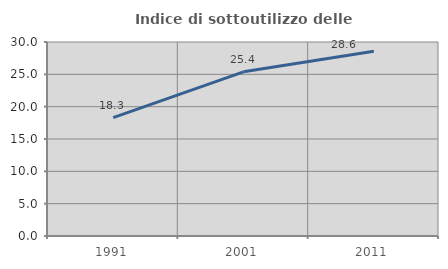
| Category | Indice di sottoutilizzo delle abitazioni  |
|---|---|
| 1991.0 | 18.307 |
| 2001.0 | 25.392 |
| 2011.0 | 28.56 |